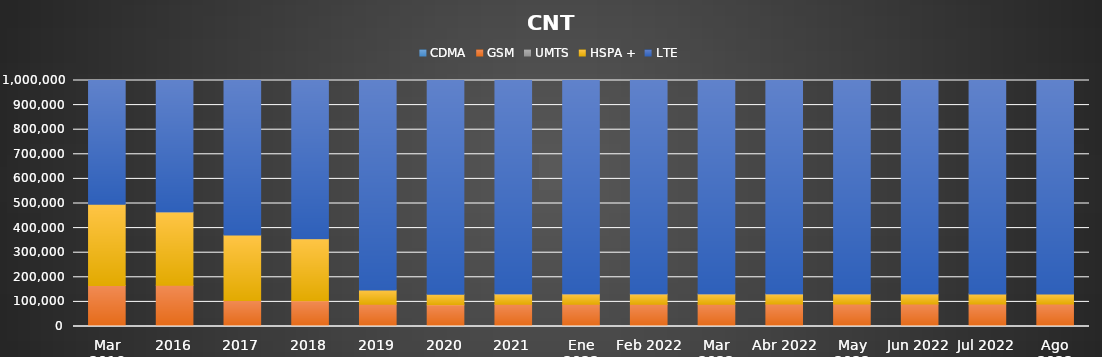
| Category | CDMA | GSM | UMTS | HSPA + | LTE |
|---|---|---|---|---|---|
| Mar 2016 | 0 | 166950 | 0 | 329835 | 678162 |
| 2016 | 0 | 167794 | 0 | 297924 | 1075501 |
| 2017 | 0 | 105840 | 0 | 265966 | 1770311 |
| 2018 | 0 | 104907 | 0 | 252233 | 2488002 |
| 2019 | 0 | 90785 | 0 | 57576 | 2755329 |
| 2020 | 0 | 88328 | 0 | 42633 | 2695427 |
| 2021 | 0 | 90490 | 0 | 41720 | 2737207 |
| Ene 2022 | 0 | 90494 | 0 | 41783 | 2747791 |
| Feb 2022 | 0 | 90620 | 0 | 41640 | 2753688 |
| Mar 2022 | 0 | 90669 | 0 | 41489 | 2761348 |
| Abr 2022 | 0 | 91159 | 0 | 41412 | 2772081 |
| May 2022 | 0 | 91080 | 0 | 41208 | 2783764 |
| Jun 2022 | 0 | 91099 | 0 | 41107 | 2794736 |
| Jul 2022 | 0 | 91112 | 0 | 41044 | 2808197 |
| Ago 2022 | 0 | 91052 | 0 | 40970 | 2821980 |